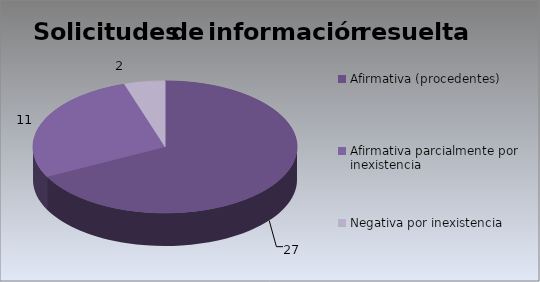
| Category | Series 0 |
|---|---|
| Afirmativa (procedentes) | 27 |
| Afirmativa parcialmente por inexistencia | 11 |
| Negativa por inexistencia | 2 |